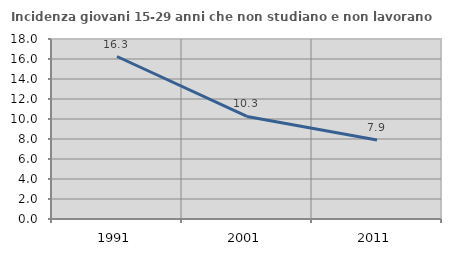
| Category | Incidenza giovani 15-29 anni che non studiano e non lavorano  |
|---|---|
| 1991.0 | 16.25 |
| 2001.0 | 10.256 |
| 2011.0 | 7.895 |